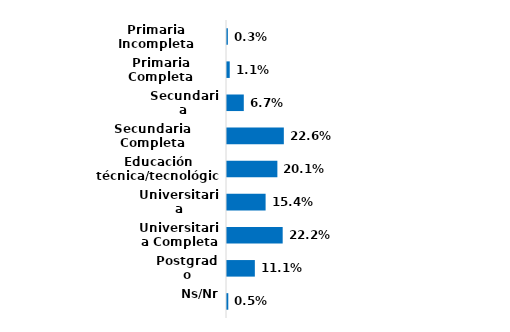
| Category | Series 0 |
|---|---|
| Primaria Incompleta | 0.003 |
| Primaria Completa | 0.011 |
| Secundaria Incompleta | 0.067 |
| Secundaria Completa | 0.226 |
| Educación técnica/tecnológica | 0.201 |
| Universitaria Incompleta | 0.154 |
| Universitaria Completa | 0.222 |
| Postgrado | 0.111 |
| Ns/Nr | 0.005 |